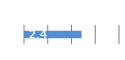
| Category | Series 0 |
|---|---|
| 0 | 2.427 |